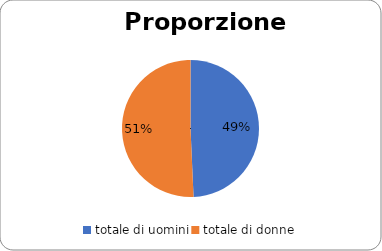
| Category | Series 0 |
|---|---|
| totale di uomini | 0.493 |
| totale di donne | 0.507 |